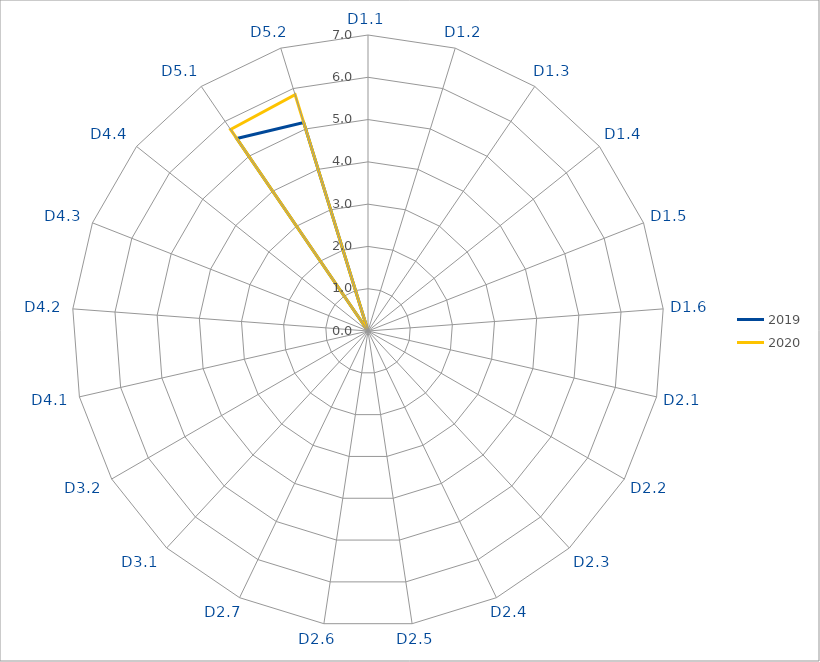
| Category | 2019 | 2020 |
|---|---|---|
| D1.1 | 0 | 0 |
| D1.2 | 0 | 0 |
| D1.3 | 0 | 0 |
| D1.4 | 0 | 0 |
| D1.5 | 0 | 0 |
| D1.6 | 0 | 0 |
| D2.1 | 0 | 0 |
| D2.2 | 0 | 0 |
| D2.3 | 0 | 0 |
| D2.4 | 0 | 0 |
| D2.5 | 0 | 0 |
| D2.6 | 0 | 0 |
| D2.7 | 0 | 0 |
| D3.1 | 0 | 0 |
| D3.2 | 0 | 0 |
| D4.1 | 0 | 0 |
| D4.2 | 0 | 0 |
| D4.3 | 0 | 0 |
| D4.4 | 0 | 0 |
| D5.1 | 5.51 | 5.77 |
| D5.2 | 5.16 | 5.85 |